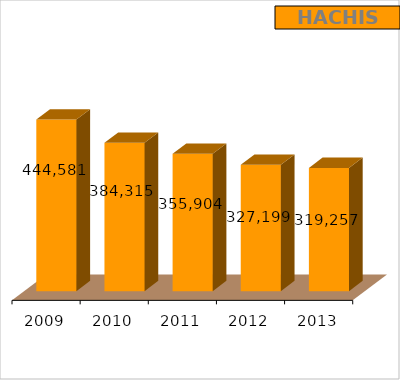
| Category | Hachís |
|---|---|
| 2009.0 | 444581 |
| 2010.0 | 384315 |
| 2011.0 | 355904 |
| 2012.0 | 327199 |
| 2013.0 | 319257 |